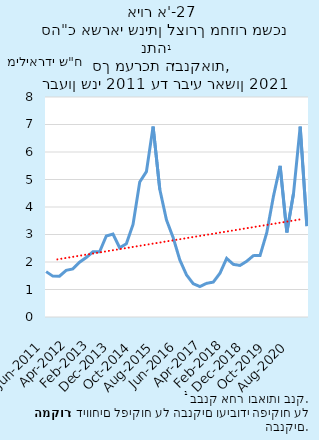
| Category | סה"כ אשראי שניתן לצורך מחזור משכנתא (בבנק אחר ובאותו בנק) |
|---|---|
| 2011-06-30 | 1.65 |
| 2011-09-30 | 1.487 |
| 2011-12-31 | 1.483 |
| 2012-03-31 | 1.699 |
| 2012-06-30 | 1.75 |
| 2012-09-30 | 1.993 |
| 2012-12-31 | 2.164 |
| 2013-03-31 | 2.37 |
| 2013-06-30 | 2.37 |
| 2013-09-30 | 2.947 |
| 2013-12-31 | 3.015 |
| 2014-03-31 | 2.517 |
| 2014-06-30 | 2.664 |
| 2014-09-30 | 3.365 |
| 2014-12-31 | 4.909 |
| 2015-03-31 | 5.286 |
| 2015-06-30 | 6.925 |
| 2015-09-30 | 4.643 |
| 2015-12-31 | 3.53 |
| 2016-03-31 | 2.886 |
| 2016-06-30 | 2.072 |
| 2016-09-30 | 1.529 |
| 2016-12-31 | 1.211 |
| 2017-03-31 | 1.108 |
| 2017-06-30 | 1.224 |
| 2017-09-30 | 1.269 |
| 2017-12-31 | 1.591 |
| 2018-03-31 | 2.132 |
| 2018-06-30 | 1.914 |
| 2018-09-30 | 1.875 |
| 2018-12-31 | 2.027 |
| 2019-03-31 | 2.231 |
| 2019-06-30 | 2.239 |
| 2019-09-30 | 3.066 |
| 2019-12-31 | 4.39 |
| 2020-03-31 | 5.499 |
| 2020-06-30 | 3.075 |
| 2020-09-30 | 4.489 |
| 2020-12-31 | 6.921 |
| 2021-03-31 | 3.305 |